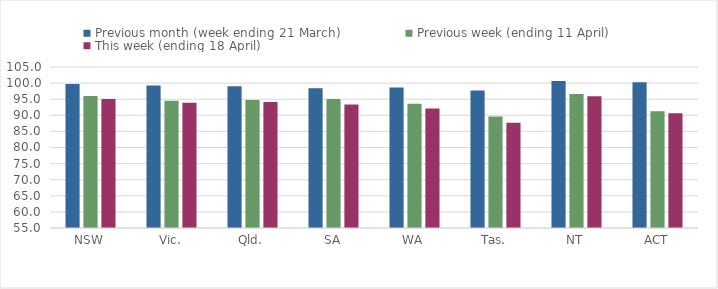
| Category | Previous month (week ending 21 March) | Previous week (ending 11 April) | This week (ending 18 April) |
|---|---|---|---|
| NSW | 99.718 | 95.994 | 95.087 |
| Vic. | 99.223 | 94.499 | 93.881 |
| Qld. | 98.984 | 94.738 | 94.13 |
| SA | 98.366 | 95.06 | 93.328 |
| WA | 98.596 | 93.553 | 92.146 |
| Tas. | 97.7 | 89.61 | 87.72 |
| NT | 100.649 | 96.591 | 95.932 |
| ACT | 100.301 | 91.283 | 90.631 |